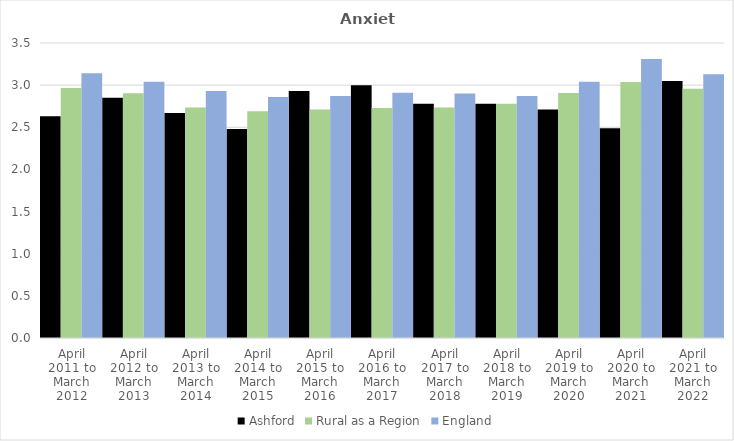
| Category | Ashford | Rural as a Region | England |
|---|---|---|---|
| April 2011 to March 2012 | 2.63 | 2.967 | 3.14 |
| April 2012 to March 2013 | 2.85 | 2.904 | 3.04 |
| April 2013 to March 2014 | 2.67 | 2.734 | 2.93 |
| April 2014 to March 2015 | 2.48 | 2.691 | 2.86 |
| April 2015 to March 2016 | 2.93 | 2.711 | 2.87 |
| April 2016 to March 2017 | 3 | 2.729 | 2.91 |
| April 2017 to March 2018 | 2.78 | 2.736 | 2.9 |
| April 2018 to March 2019 | 2.78 | 2.78 | 2.87 |
| April 2019 to March 2020 | 2.71 | 2.908 | 3.04 |
| April 2020 to March 2021 | 2.49 | 3.036 | 3.31 |
| April 2021 to March 2022 | 3.05 | 2.956 | 3.13 |